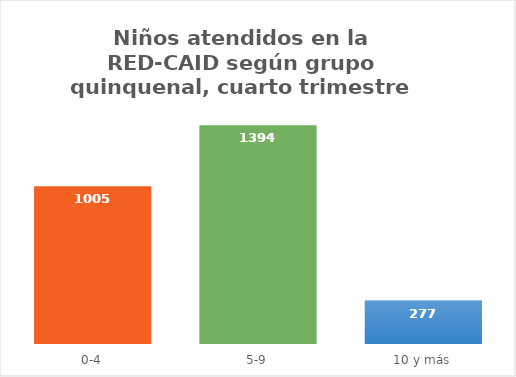
| Category | Cantidad |
|---|---|
| 0-4 | 1005 |
| 5-9 | 1394 |
| 10 y más | 277 |